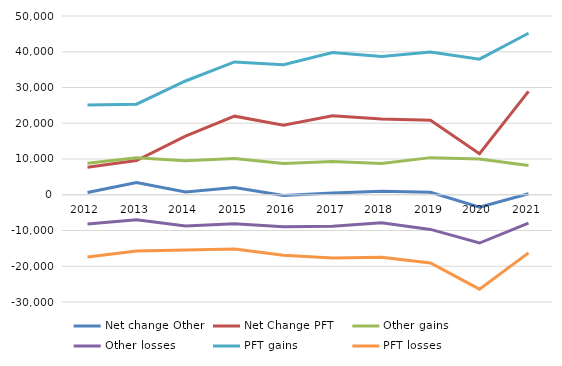
| Category | Net change Other  | Net Change PFT  | Other gains | Other losses | PFT gains | PFT losses |
|---|---|---|---|---|---|---|
| 2012.0 | 629 | 7681 | 8811 | -8182 | 25079 | -17398 |
| 2013.0 | 3387 | 9587 | 10357 | -6970 | 25346 | -15759 |
| 2014.0 | 777 | 16372 | 9503 | -8726 | 31824 | -15452 |
| 2015.0 | 2010 | 21981 | 10125 | -8115 | 37160 | -15179 |
| 2016.0 | -239 | 19462 | 8739 | -8978 | 36378 | -16916 |
| 2017.0 | 477 | 22067 | 9310 | -8833 | 39769 | -17702 |
| 2018.0 | 944 | 21222 | 8750 | -7806 | 38706 | -17484 |
| 2019.0 | 685 | 20844 | 10382 | -9697 | 39946 | -19102 |
| 2020.0 | -3475 | 11503 | 10026 | -13501 | 37917 | -26414 |
| 2021.0 | 292 | 28909 | 8209 | -7917 | 45176 | -16267 |